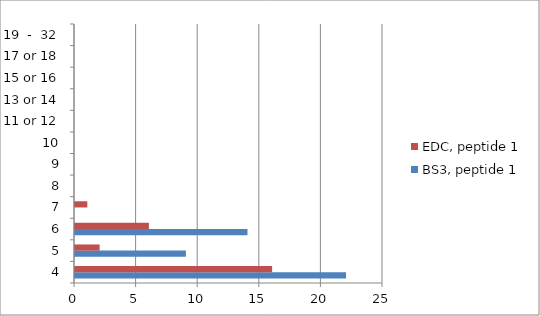
| Category | BS3, peptide 1 | EDC, peptide 1 |
|---|---|---|
| 4 | 22 | 16 |
| 5 | 9 | 2 |
| 6 | 14 | 6 |
| 7 | 0 | 1 |
| 8 | 0 | 0 |
| 9 | 0 | 0 |
| 10 | 0 | 0 |
| 11 or 12 | 0 | 0 |
| 13 or 14 | 0 | 0 |
| 15 or 16 | 0 | 0 |
| 17 or 18 | 0 | 0 |
| 19  -  32 | 0 | 0 |